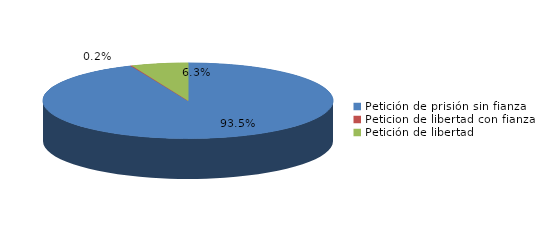
| Category | Series 0 |
|---|---|
| Petición de prisión sin fianza | 2039 |
| Peticion de libertad con fianza | 4 |
| Petición de libertad | 137 |